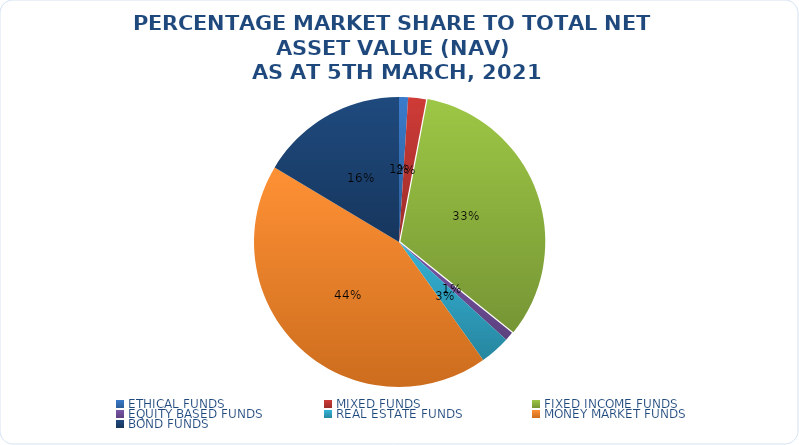
| Category | NET ASSET VALUE |
|---|---|
| ETHICAL FUNDS | 14938992201.47 |
| MIXED FUNDS | 29391005792.019 |
| FIXED INCOME FUNDS | 484059529067.436 |
| EQUITY BASED FUNDS | 14580937559.65 |
| REAL ESTATE FUNDS | 49951177778.721 |
| MONEY MARKET FUNDS | 641814373405.472 |
| BOND FUNDS | 242273037456.74 |